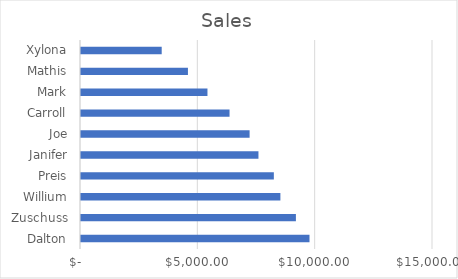
| Category | Sales |
|---|---|
| Dalton | 9737 |
| Zuschuss | 9158 |
| Willium | 8497 |
| Preis | 8218 |
| Janifer | 7562 |
| Joe | 7185 |
| Carroll | 6330 |
| Mark | 5389 |
| Mathis | 4557 |
| Xylona | 3439 |